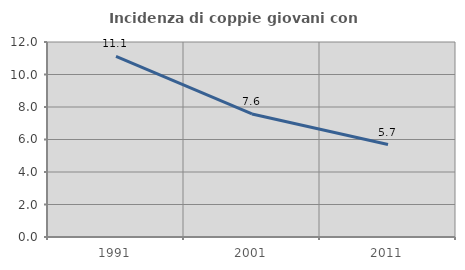
| Category | Incidenza di coppie giovani con figli |
|---|---|
| 1991.0 | 11.114 |
| 2001.0 | 7.571 |
| 2011.0 | 5.687 |